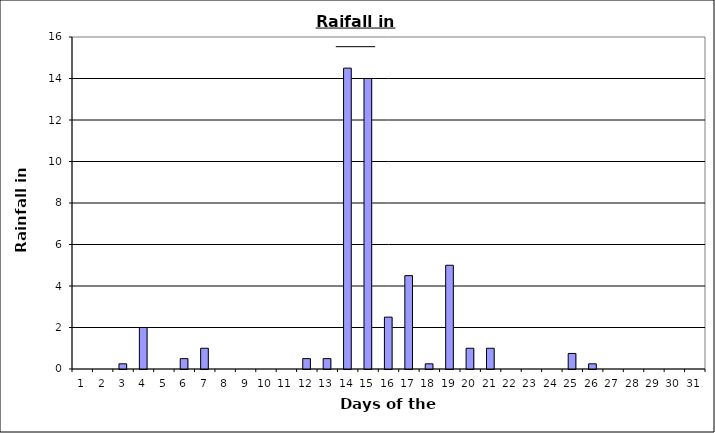
| Category | Series 0 |
|---|---|
| 0 | 0 |
| 1 | 0 |
| 2 | 0.25 |
| 3 | 2 |
| 4 | 0 |
| 5 | 0.5 |
| 6 | 1 |
| 7 | 0 |
| 8 | 0 |
| 9 | 0 |
| 10 | 0 |
| 11 | 0.5 |
| 12 | 0.5 |
| 13 | 14.5 |
| 14 | 14 |
| 15 | 2.5 |
| 16 | 4.5 |
| 17 | 0.25 |
| 18 | 5 |
| 19 | 1 |
| 20 | 1 |
| 21 | 0 |
| 22 | 0 |
| 23 | 0 |
| 24 | 0.75 |
| 25 | 0.25 |
| 26 | 0 |
| 27 | 0 |
| 28 | 0 |
| 29 | 0 |
| 30 | 0 |